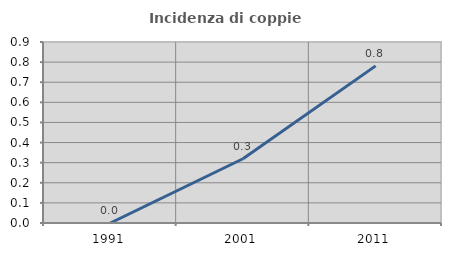
| Category | Incidenza di coppie miste |
|---|---|
| 1991.0 | 0 |
| 2001.0 | 0.319 |
| 2011.0 | 0.781 |